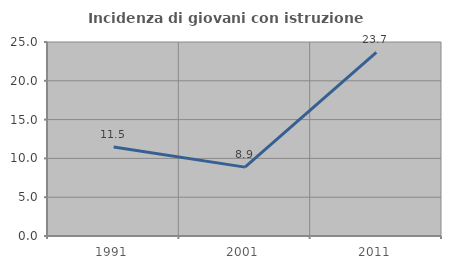
| Category | Incidenza di giovani con istruzione universitaria |
|---|---|
| 1991.0 | 11.461 |
| 2001.0 | 8.876 |
| 2011.0 | 23.659 |